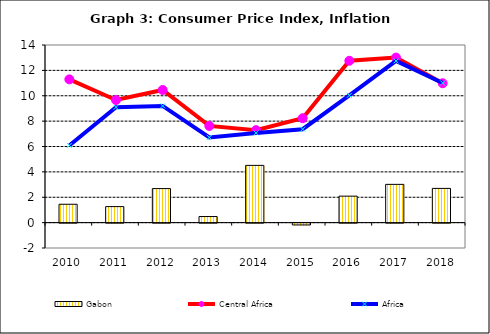
| Category | Gabon |
|---|---|
| 2010.0 | 1.447 |
| 2011.0 | 1.262 |
| 2012.0 | 2.683 |
| 2013.0 | 0.48 |
| 2014.0 | 4.512 |
| 2015.0 | -0.143 |
| 2016.0 | 2.086 |
| 2017.0 | 3.015 |
| 2018.0 | 2.697 |